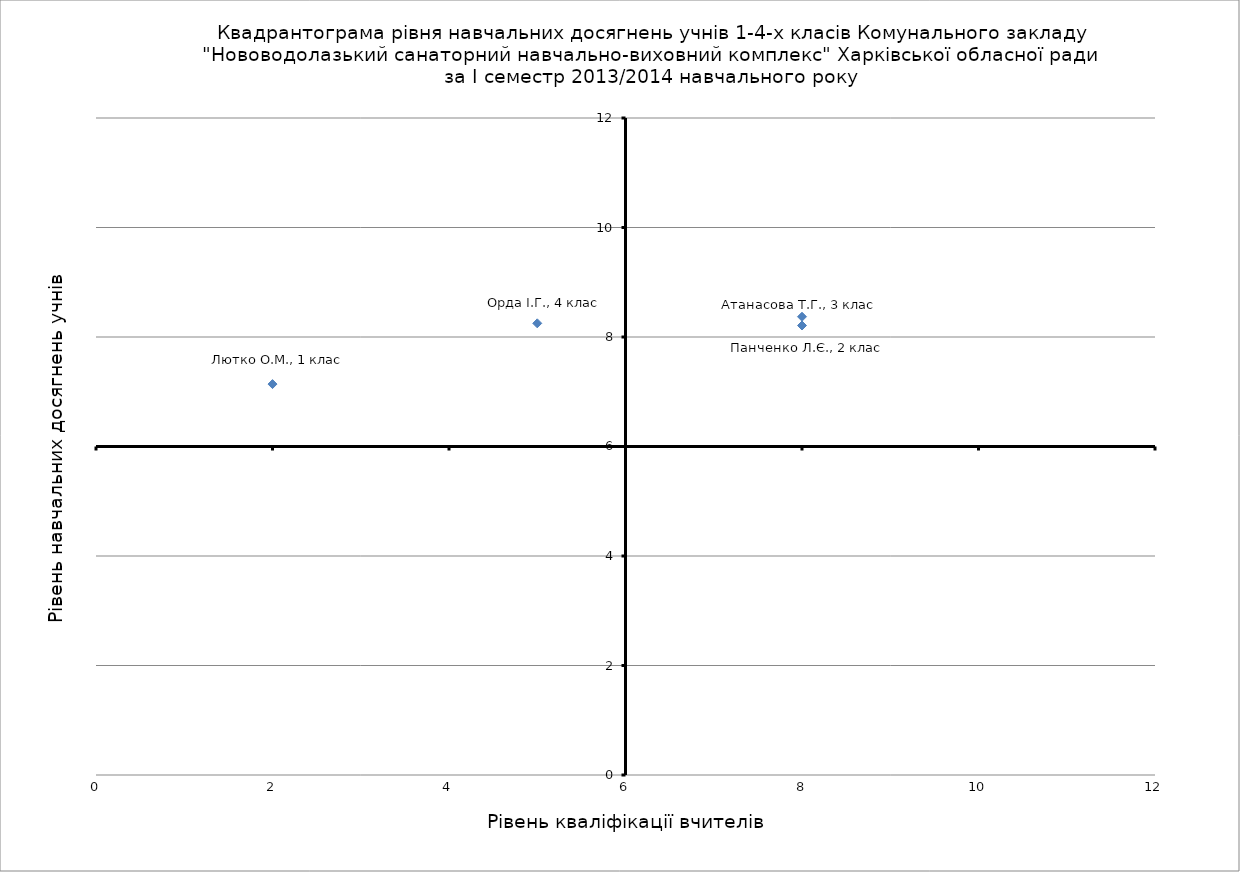
| Category | Рівень навчальних досягнень учнів |
|---|---|
| 2.0 | 7.14 |
| 8.0 | 8.21 |
| 8.0 | 8.37 |
| 5.0 | 8.25 |